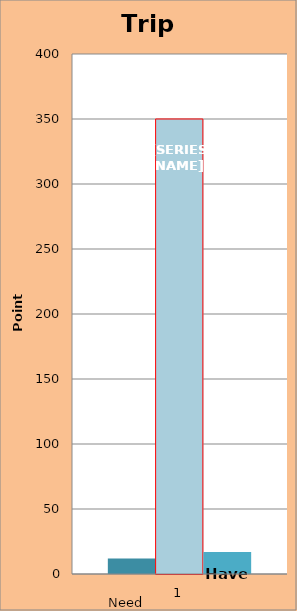
| Category | Goal | Trip | Have |
|---|---|---|---|
| 0 | 12 | 350 | 17 |